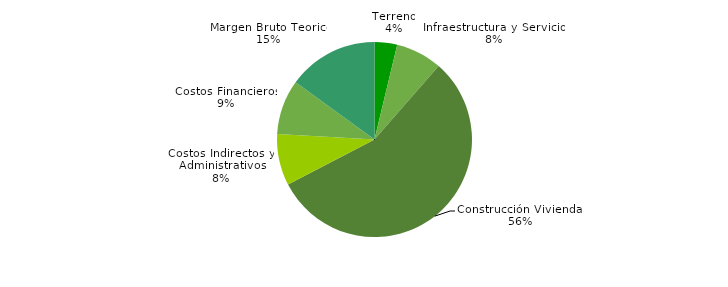
| Category | Series 0 |
|---|---|
| Terreno | 0.038 |
| Infraestructura y Servicios | 0.077 |
| Construcción Viviendas | 0.559 |
| Costos Indirectos y  Administrativos | 0.085 |
| Costos Financieros | 0.091 |
| Margen Bruto Teorico | 0.15 |